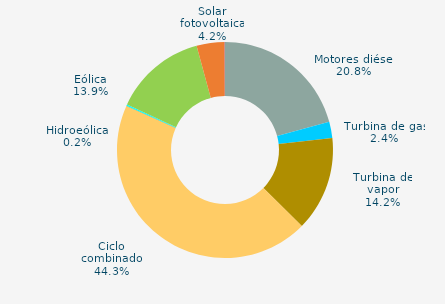
| Category | Series 0 |
|---|---|
| Motores diésel | 20.79 |
| Turbina de gas | 2.443 |
| Turbina de vapor | 14.173 |
| Ciclo combinado | 44.282 |
| Cogeneración | 0 |
| Hidráulica | 0.039 |
| Hidroeólica | 0.177 |
| Eólica | 13.856 |
| Solar fotovoltaica | 4.19 |
| Otras renovables | 0.05 |